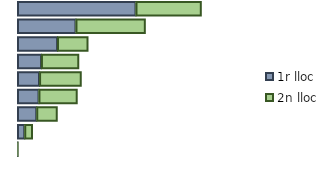
| Category | 1r lloc | 2n lloc |
|---|---|---|
| 0 | 38.1 | 21 |
| 1 | 18.8 | 22.3 |
| 2 | 12.9 | 9.8 |
| 3 | 7.7 | 12 |
| 4 | 7.1 | 13.4 |
| 5 | 6.9 | 12.3 |
| 6 | 6.2 | 6.6 |
| 7 | 2.3 | 2.5 |
| 8 | 0.1 | 0.2 |